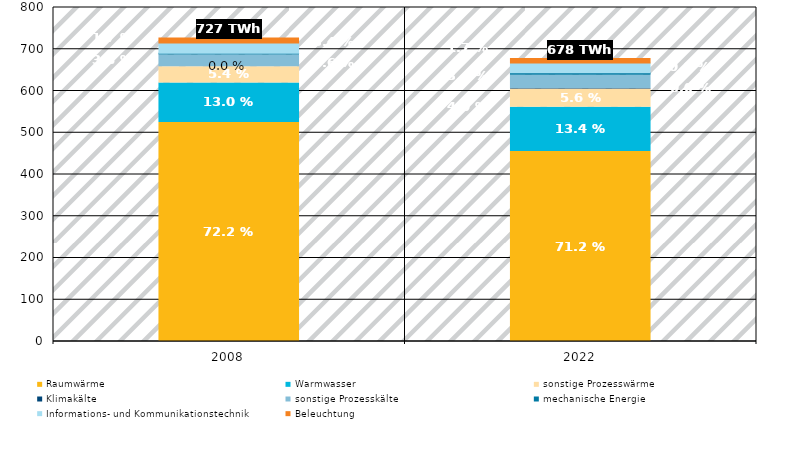
| Category | Raumwärme | Warmwasser | sonstige Prozesswärme | Klimakälte | sonstige Prozesskälte | mechanische Energie | Informations- und Kommunikationstechnik | Beleuchtung | Gesamt |
|---|---|---|---|---|---|---|---|---|---|
| 2008.0 | 524.703 | 94.699 | 38.904 | 0 | 27.695 | 4.283 | 24.513 | 12.174 | 726.972 |
| 2022.0 | 454.951 | 105.834 | 43.735 | 1.389 | 31.558 | 5.974 | 23.613 | 11.056 | 678.109 |